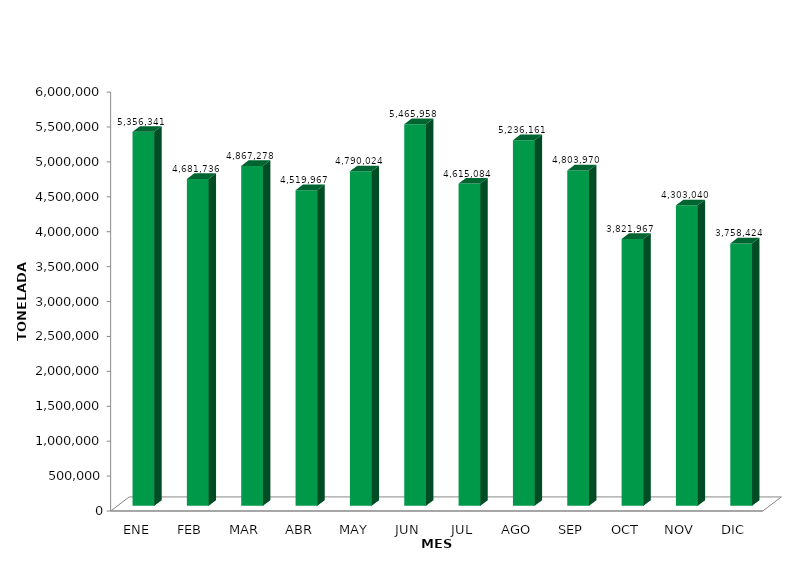
| Category | Series 0 |
|---|---|
| ENE | 5356340.726 |
| FEB | 4681736.232 |
| MAR | 4867277.646 |
| ABR | 4519967.318 |
| MAY | 4790024.068 |
| JUN | 5465957.737 |
| JUL | 4615084.362 |
| AGO | 5236160.682 |
| SEP | 4803969.756 |
| OCT | 3821966.865 |
| NOV | 4303039.697 |
| DIC | 3758423.741 |